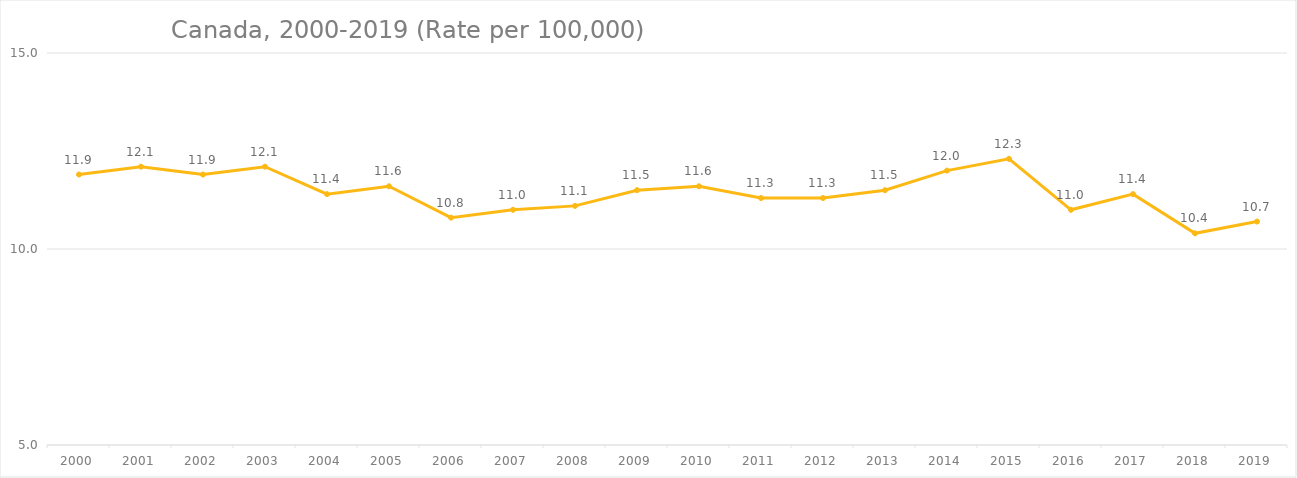
| Category | Series 0 |
|---|---|
| 2000.0 | 11.9 |
| 2001.0 | 12.1 |
| 2002.0 | 11.9 |
| 2003.0 | 12.1 |
| 2004.0 | 11.4 |
| 2005.0 | 11.6 |
| 2006.0 | 10.8 |
| 2007.0 | 11 |
| 2008.0 | 11.1 |
| 2009.0 | 11.5 |
| 2010.0 | 11.6 |
| 2011.0 | 11.3 |
| 2012.0 | 11.3 |
| 2013.0 | 11.5 |
| 2014.0 | 12 |
| 2015.0 | 12.3 |
| 2016.0 | 11 |
| 2017.0 | 11.4 |
| 2018.0 | 10.4 |
| 2019.0 | 10.7 |